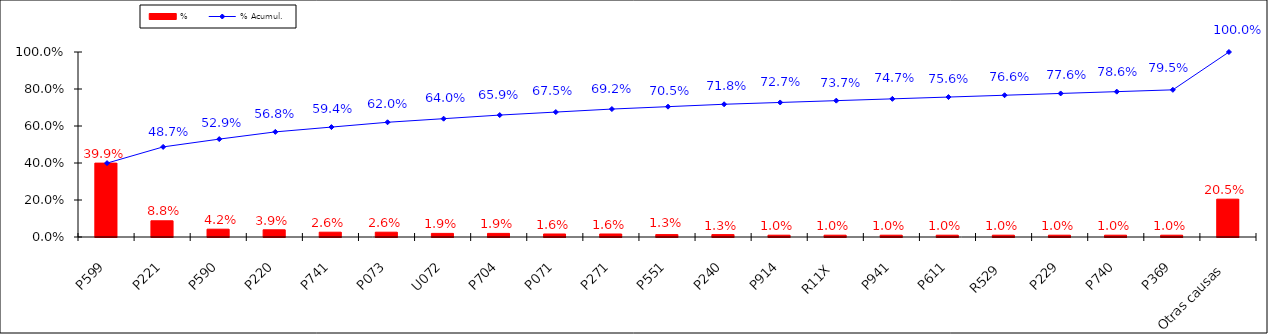
| Category | % |
|---|---|
| P599 | 0.399 |
| P221 | 0.088 |
| P590 | 0.042 |
| P220 | 0.039 |
| P741 | 0.026 |
| P073 | 0.026 |
| U072 | 0.019 |
| P704 | 0.019 |
| P071 | 0.016 |
| P271 | 0.016 |
| P551 | 0.013 |
| P240 | 0.013 |
| P914 | 0.01 |
| R11X | 0.01 |
| P941 | 0.01 |
| P611 | 0.01 |
| R529 | 0.01 |
| P229 | 0.01 |
| P740 | 0.01 |
| P369 | 0.01 |
| Otras causas | 0.205 |